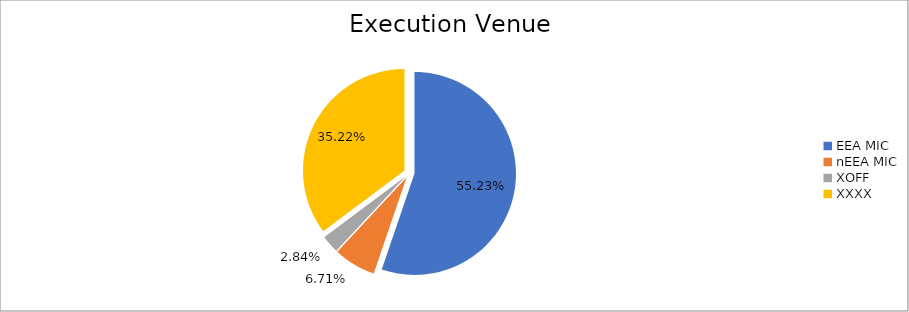
| Category | Series 0 |
|---|---|
| EEA MIC | 5927233.508 |
| nEEA MIC | 720052.284 |
| XOFF | 304811.88 |
| XXXX | 3779378.187 |